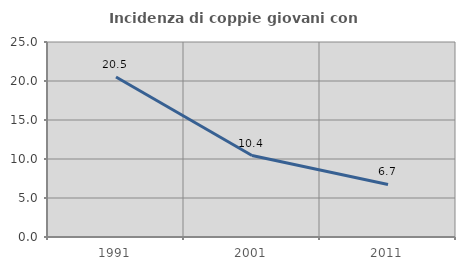
| Category | Incidenza di coppie giovani con figli |
|---|---|
| 1991.0 | 20.515 |
| 2001.0 | 10.448 |
| 2011.0 | 6.742 |